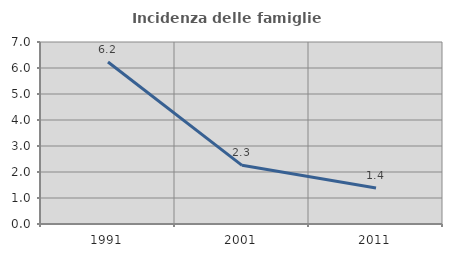
| Category | Incidenza delle famiglie numerose |
|---|---|
| 1991.0 | 6.232 |
| 2001.0 | 2.256 |
| 2011.0 | 1.387 |